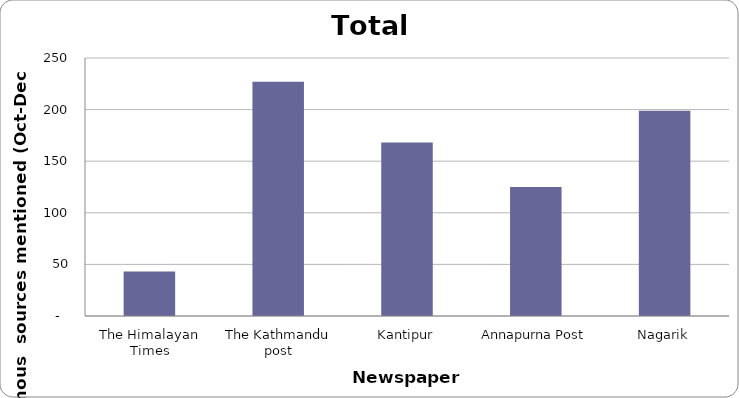
| Category | Series 0 |
|---|---|
| The Himalayan Times | 43 |
| The Kathmandu post | 227 |
| Kantipur | 168 |
| Annapurna Post | 125 |
| Nagarik | 199 |